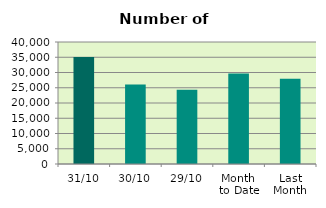
| Category | Series 0 |
|---|---|
| 31/10 | 35096 |
| 30/10 | 26046 |
| 29/10 | 24356 |
| Month 
to Date | 29672.087 |
| Last
Month | 27963.2 |